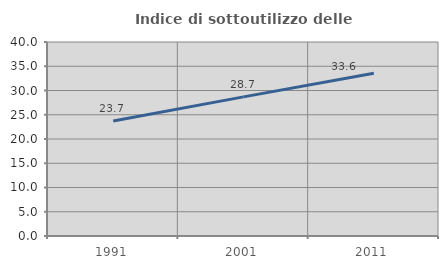
| Category | Indice di sottoutilizzo delle abitazioni  |
|---|---|
| 1991.0 | 23.716 |
| 2001.0 | 28.681 |
| 2011.0 | 33.554 |